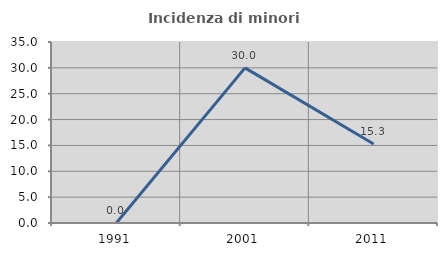
| Category | Incidenza di minori stranieri |
|---|---|
| 1991.0 | 0 |
| 2001.0 | 30 |
| 2011.0 | 15.278 |